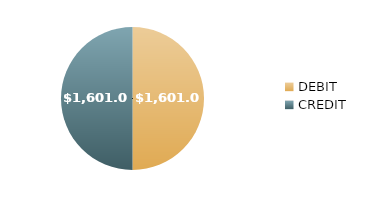
| Category | $1,601.00 $1,601.00 |
|---|---|
| DEBIT | 1601 |
| CREDIT | 1601 |